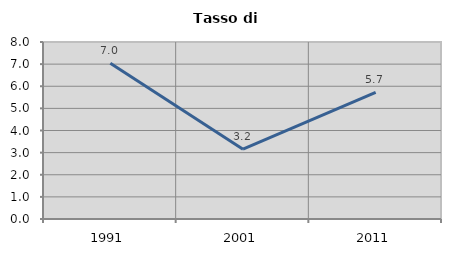
| Category | Tasso di disoccupazione   |
|---|---|
| 1991.0 | 7.039 |
| 2001.0 | 3.156 |
| 2011.0 | 5.722 |